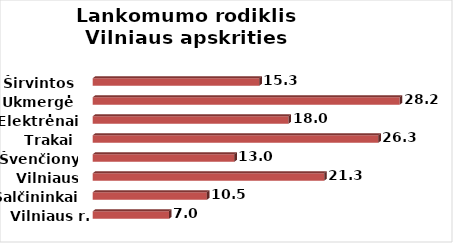
| Category | Series 0 |
|---|---|
| Vilniaus r. | 7.01 |
| Šalčininkai | 10.49 |
| Vilniaus m. | 21.27 |
| Švenčionys | 13.02 |
| Trakai | 26.25 |
| Elektrėnai | 17.99 |
| Ukmergė | 28.21 |
| Širvintos | 15.31 |